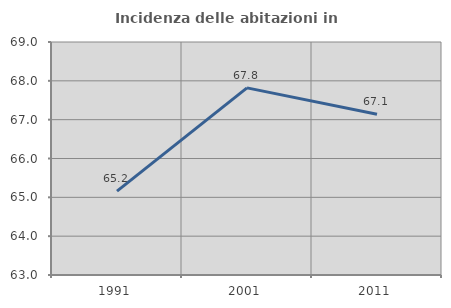
| Category | Incidenza delle abitazioni in proprietà  |
|---|---|
| 1991.0 | 65.16 |
| 2001.0 | 67.818 |
| 2011.0 | 67.138 |